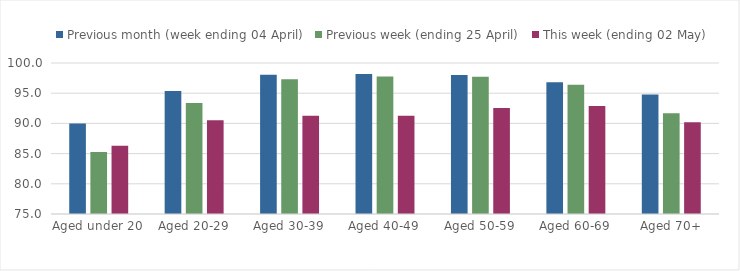
| Category | Previous month (week ending 04 April) | Previous week (ending 25 April) | This week (ending 02 May) |
|---|---|---|---|
| Aged under 20 | 89.995 | 85.245 | 86.32 |
| Aged 20-29 | 95.381 | 93.363 | 90.51 |
| Aged 30-39 | 98.059 | 97.33 | 91.261 |
| Aged 40-49 | 98.166 | 97.768 | 91.26 |
| Aged 50-59 | 98.014 | 97.732 | 92.542 |
| Aged 60-69 | 96.829 | 96.391 | 92.864 |
| Aged 70+ | 94.804 | 91.674 | 90.184 |